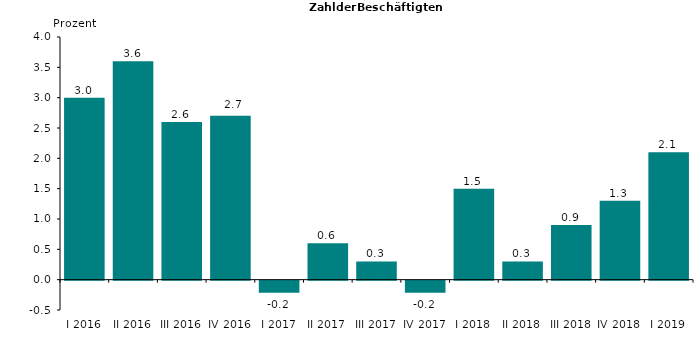
| Category | 3,0 3,6 2,6 2,7 -0,2 0,6 0,3 -0,2 1,5 0,3 0,9 1,3 2,1 |
|---|---|
| I 2016 | 3 |
| II 2016 | 3.6 |
| III 2016 | 2.6 |
| IV 2016 | 2.7 |
| I 2017 | -0.2 |
| II 2017 | 0.6 |
| III 2017 | 0.3 |
| IV 2017 | -0.2 |
| I 2018 | 1.5 |
| II 2018 | 0.3 |
| III 2018 | 0.9 |
| IV 2018 | 1.3 |
| I 2019 | 2.1 |